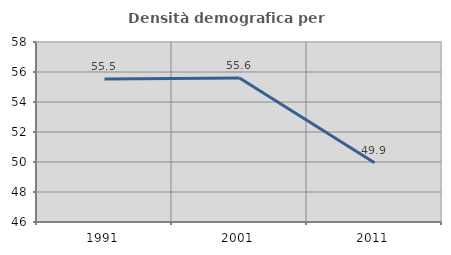
| Category | Densità demografica |
|---|---|
| 1991.0 | 55.531 |
| 2001.0 | 55.6 |
| 2011.0 | 49.945 |